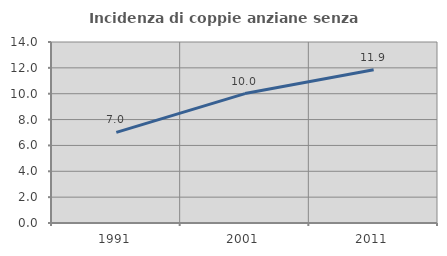
| Category | Incidenza di coppie anziane senza figli  |
|---|---|
| 1991.0 | 7.013 |
| 2001.0 | 10.012 |
| 2011.0 | 11.856 |